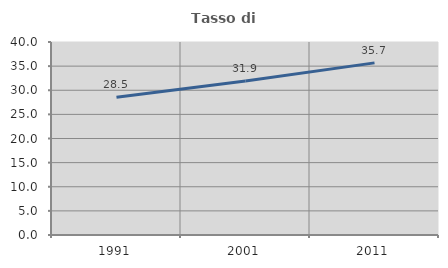
| Category | Tasso di occupazione   |
|---|---|
| 1991.0 | 28.527 |
| 2001.0 | 31.921 |
| 2011.0 | 35.673 |